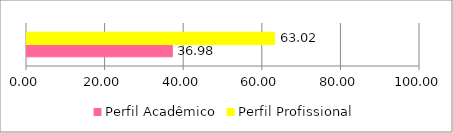
| Category | Perfil Acadêmico | Perfil Profissional |
|---|---|---|
| 0 | 36.977 | 63.023 |